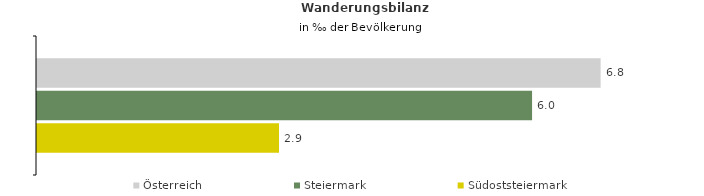
| Category | Österreich | Steiermark | Südoststeiermark |
|---|---|---|---|
| Wanderungsrate in ‰ der Bevölkerung, Periode 2018-2022 | 6.822 | 5.992 | 2.929 |